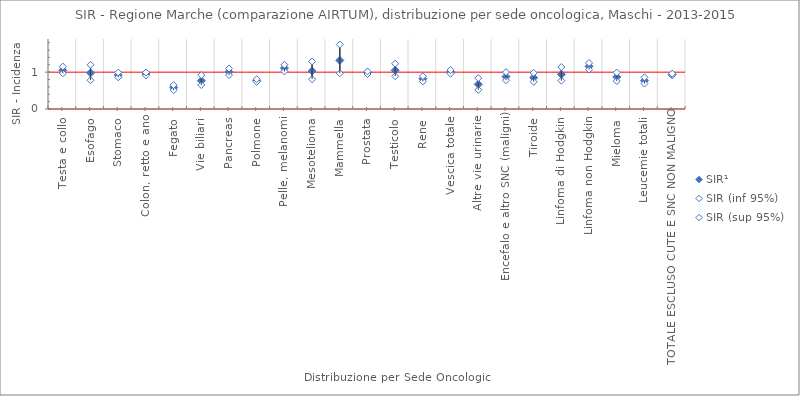
| Category | SIR¹ | SIR (inf 95%) | SIR (sup 95%) |
|---|---|---|---|
| Testa e collo | 1.05 | 0.97 | 1.15 |
| Esofago | 0.98 | 0.78 | 1.2 |
| Stomaco | 0.92 | 0.86 | 0.99 |
| Colon, retto e ano | 0.95 | 0.91 | 0.99 |
| Fegato | 0.58 | 0.51 | 0.65 |
| Vie biliari | 0.77 | 0.65 | 0.92 |
| Pancreas | 1.01 | 0.92 | 1.1 |
| Polmone | 0.77 | 0.74 | 0.81 |
| Pelle, melanomi | 1.11 | 1.02 | 1.2 |
| Mesotelioma | 1.03 | 0.81 | 1.29 |
| Mammella | 1.32 | 0.97 | 1.75 |
| Prostata | 0.99 | 0.95 | 1.02 |
| Testicolo | 1.05 | 0.89 | 1.23 |
| Rene | 0.82 | 0.75 | 0.89 |
| Vescica totale | 1.01 | 0.96 | 1.06 |
| Altre vie urinarie | 0.67 | 0.52 | 0.84 |
| Encefalo e altro SNC (maligni) | 0.88 | 0.78 | 1 |
| Tiroide | 0.85 | 0.74 | 0.98 |
| Linfoma di Hodgkin | 0.94 | 0.77 | 1.14 |
| Linfoma non Hodgkin | 1.16 | 1.07 | 1.25 |
| Mieloma | 0.87 | 0.76 | 0.99 |
| Leucemie totali | 0.77 | 0.69 | 0.86 |
| TOTALE ESCLUSO CUTE E SNC NON MALIGNO | 0.93 | 0.92 | 0.96 |